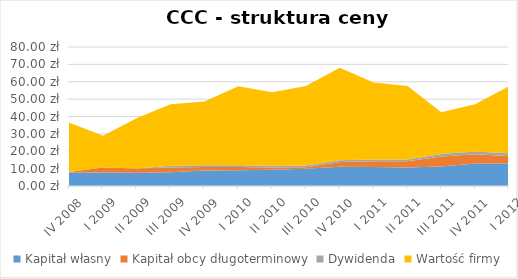
| Category | Kapitał własny | Kapitał obcy długoterminowy | Dywidenda | Wartość firmy |
|---|---|---|---|---|
| IV 2008 | 7.713 | 0.384 | 0 | 28.403 |
| I 2009 | 7.787 | 2.927 | 0 | 18.236 |
| II 2009 | 7.605 | 2.403 | 0 | 28.992 |
| III 2009 | 7.893 | 2.792 | 1 | 35.315 |
| IV 2009 | 8.86 | 2.119 | 1 | 36.622 |
| I 2010 | 8.993 | 2.001 | 1 | 45.356 |
| II 2010 | 9.332 | 1.33 | 1 | 42.338 |
| III 2010 | 9.897 | 0.943 | 1 | 45.66 |
| IV 2010 | 11.012 | 2.737 | 1 | 53.251 |
| I 2011 | 10.894 | 3.344 | 1 | 44.261 |
| II 2011 | 10.69 | 3.536 | 1 | 42.274 |
| III 2011 | 11.209 | 5.77 | 1.5 | 23.921 |
| IV 2011 | 12.893 | 5.431 | 1.5 | 27.176 |
| I 2012 | 12.984 | 4.317 | 1.5 | 38.649 |